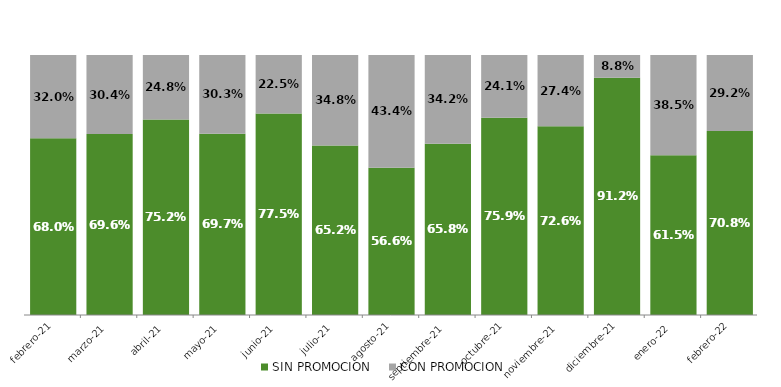
| Category | SIN PROMOCION   | CON PROMOCION   |
|---|---|---|
| 2021-02-01 | 0.68 | 0.32 |
| 2021-03-01 | 0.696 | 0.304 |
| 2021-04-01 | 0.752 | 0.248 |
| 2021-05-01 | 0.697 | 0.303 |
| 2021-06-01 | 0.775 | 0.225 |
| 2021-07-01 | 0.652 | 0.348 |
| 2021-08-01 | 0.566 | 0.434 |
| 2021-09-01 | 0.658 | 0.342 |
| 2021-10-01 | 0.759 | 0.241 |
| 2021-11-01 | 0.726 | 0.274 |
| 2021-12-01 | 0.912 | 0.088 |
| 2022-01-01 | 0.615 | 0.385 |
| 2022-02-01 | 0.708 | 0.292 |